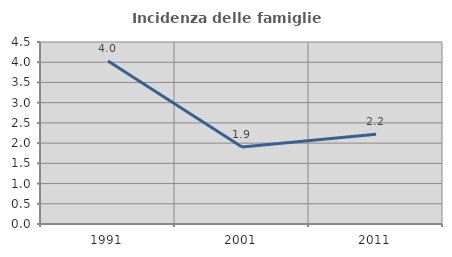
| Category | Incidenza delle famiglie numerose |
|---|---|
| 1991.0 | 4.028 |
| 2001.0 | 1.906 |
| 2011.0 | 2.22 |